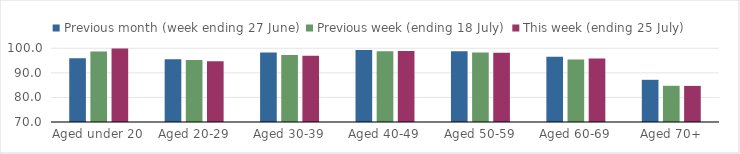
| Category | Previous month (week ending 27 June) | Previous week (ending 18 July) | This week (ending 25 July) |
|---|---|---|---|
| Aged under 20 | 95.971 | 98.713 | 99.916 |
| Aged 20-29 | 95.525 | 95.236 | 94.762 |
| Aged 30-39 | 98.331 | 97.218 | 96.987 |
| Aged 40-49 | 99.326 | 98.802 | 98.863 |
| Aged 50-59 | 98.823 | 98.269 | 98.202 |
| Aged 60-69 | 96.552 | 95.472 | 95.809 |
| Aged 70+ | 87.168 | 84.735 | 84.695 |